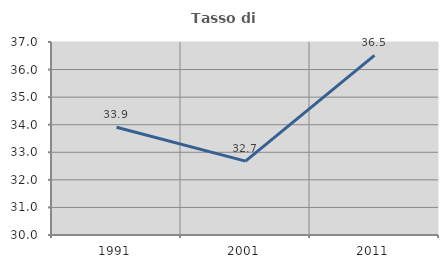
| Category | Tasso di occupazione   |
|---|---|
| 1991.0 | 33.907 |
| 2001.0 | 32.68 |
| 2011.0 | 36.515 |